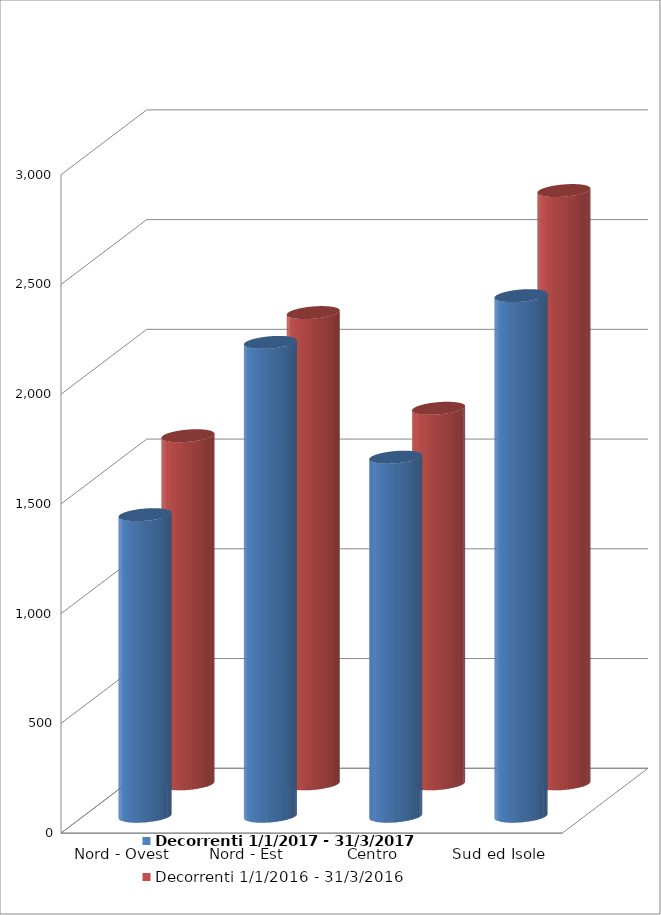
| Category | Decorrenti 1/1/2017 - 31/3/2017 | Decorrenti 1/1/2016 - 31/3/2016 |
|---|---|---|
| Nord - Ovest | 1374 | 1586 |
| Nord - Est | 2159 | 2147 |
| Centro | 1636 | 1711 |
| Sud ed Isole | 2372 | 2703 |